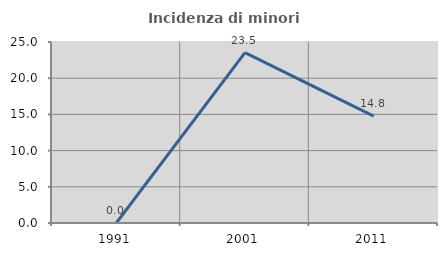
| Category | Incidenza di minori stranieri |
|---|---|
| 1991.0 | 0 |
| 2001.0 | 23.529 |
| 2011.0 | 14.754 |